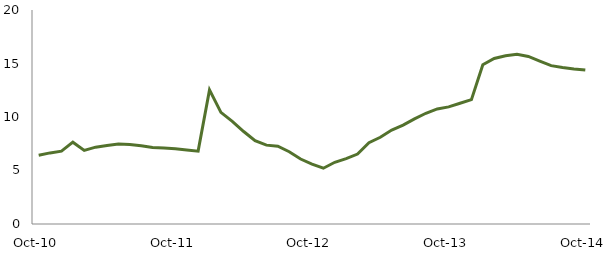
| Category | Series 0 |
|---|---|
| Oct-10 | 6.424 |
|  | 6.645 |
|  | 6.81 |
|  | 7.648 |
|  | 6.876 |
|  | 7.18 |
|  | 7.339 |
|  | 7.477 |
|  | 7.434 |
|  | 7.306 |
|  | 7.15 |
|  | 7.099 |
| Oct-11 | 7.034 |
|  | 6.917 |
|  | 6.811 |
|  | 12.531 |
|  | 10.433 |
|  | 9.6 |
|  | 8.643 |
|  | 7.789 |
|  | 7.371 |
|  | 7.266 |
|  | 6.753 |
|  | 6.075 |
| Oct-12 | 5.6 |
|  | 5.212 |
|  | 5.768 |
|  | 6.103 |
|  | 6.533 |
|  | 7.592 |
|  | 8.106 |
|  | 8.783 |
|  | 9.237 |
|  | 9.823 |
|  | 10.349 |
|  | 10.753 |
| Oct-13 | 10.947 |
|  | 11.281 |
|  | 11.624 |
|  | 14.885 |
|  | 15.473 |
|  | 15.725 |
|  | 15.855 |
|  | 15.657 |
|  | 15.222 |
|  | 14.798 |
|  | 14.629 |
|  | 14.492 |
| Oct-14 | 14.388 |